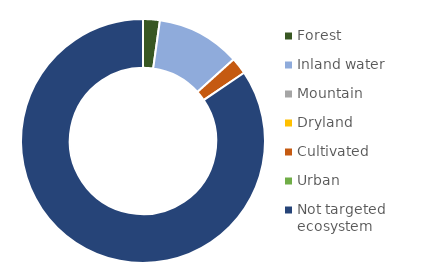
| Category | Series 0 |
|---|---|
| Forest | 1 |
| Inland water | 5 |
| Mountain | 0 |
| Dryland | 0 |
| Cultivated | 1 |
| Urban | 0 |
| Not targeted ecosystem | 38 |